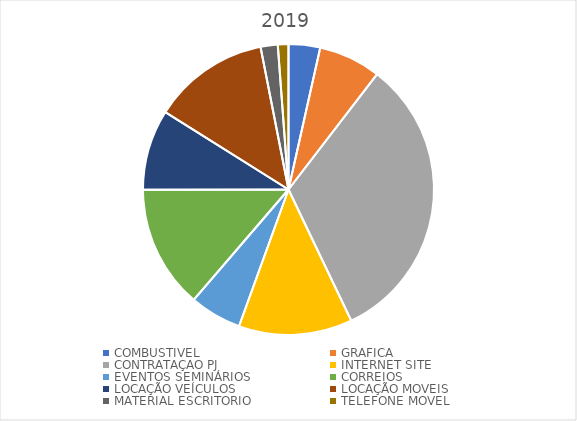
| Category | Series 0 |
|---|---|
| COMBUSTIVEL | 10398.29 |
| GRAFICA | 20496.62 |
| CONTRATAÇAO PJ | 96300 |
| INTERNET SITE | 37441.24 |
| EVENTOS SEMINÁRIOS | 17097 |
| CORREIOS | 40531.94 |
| LOCAÇÃO VEÍCULOS | 26559.99 |
| LOCAÇÃO MOVEIS | 38520 |
| MATERIAL ESCRITORIO | 5652.93 |
| TELEFONE MOVEL | 3496.7 |